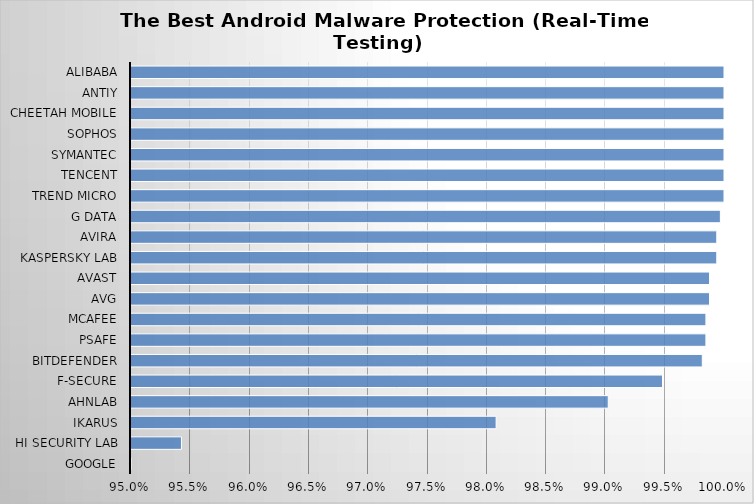
| Category | Series 0 |
|---|---|
| Google | 0.589 |
| Hi Security Lab | 0.954 |
| Ikarus | 0.981 |
| AhnLab | 0.99 |
| F-Secure | 0.995 |
| Bitdefender | 0.998 |
| PSafe | 0.998 |
| McAfee | 0.998 |
| AVG | 0.999 |
| Avast | 0.999 |
| Kaspersky Lab | 0.999 |
| Avira | 0.999 |
| G Data | 1 |
| Trend Micro | 1 |
| Tencent | 1 |
| Symantec | 1 |
| Sophos | 1 |
| Cheetah Mobile | 1 |
| Antiy | 1 |
| Alibaba | 1 |